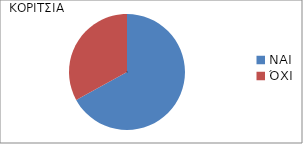
| Category | Series 1 | Series 0 |
|---|---|---|
| ΝΑΙ | 0.67 | 0.44 |
| ΌΧΙ | 0.33 | 0.56 |